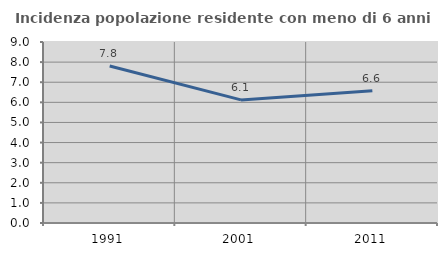
| Category | Incidenza popolazione residente con meno di 6 anni |
|---|---|
| 1991.0 | 7.809 |
| 2001.0 | 6.121 |
| 2011.0 | 6.579 |